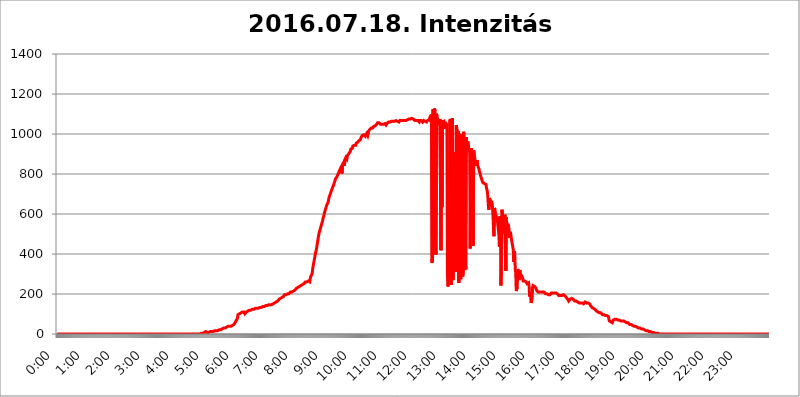
| Category | 2016.07.18. Intenzitás [W/m^2] |
|---|---|
| 0.0 | 0 |
| 0.0006944444444444445 | 0 |
| 0.001388888888888889 | 0 |
| 0.0020833333333333333 | 0 |
| 0.002777777777777778 | 0 |
| 0.003472222222222222 | 0 |
| 0.004166666666666667 | 0 |
| 0.004861111111111111 | 0 |
| 0.005555555555555556 | 0 |
| 0.0062499999999999995 | 0 |
| 0.006944444444444444 | 0 |
| 0.007638888888888889 | 0 |
| 0.008333333333333333 | 0 |
| 0.009027777777777779 | 0 |
| 0.009722222222222222 | 0 |
| 0.010416666666666666 | 0 |
| 0.011111111111111112 | 0 |
| 0.011805555555555555 | 0 |
| 0.012499999999999999 | 0 |
| 0.013194444444444444 | 0 |
| 0.013888888888888888 | 0 |
| 0.014583333333333332 | 0 |
| 0.015277777777777777 | 0 |
| 0.015972222222222224 | 0 |
| 0.016666666666666666 | 0 |
| 0.017361111111111112 | 0 |
| 0.018055555555555557 | 0 |
| 0.01875 | 0 |
| 0.019444444444444445 | 0 |
| 0.02013888888888889 | 0 |
| 0.020833333333333332 | 0 |
| 0.02152777777777778 | 0 |
| 0.022222222222222223 | 0 |
| 0.02291666666666667 | 0 |
| 0.02361111111111111 | 0 |
| 0.024305555555555556 | 0 |
| 0.024999999999999998 | 0 |
| 0.025694444444444447 | 0 |
| 0.02638888888888889 | 0 |
| 0.027083333333333334 | 0 |
| 0.027777777777777776 | 0 |
| 0.02847222222222222 | 0 |
| 0.029166666666666664 | 0 |
| 0.029861111111111113 | 0 |
| 0.030555555555555555 | 0 |
| 0.03125 | 0 |
| 0.03194444444444445 | 0 |
| 0.03263888888888889 | 0 |
| 0.03333333333333333 | 0 |
| 0.034027777777777775 | 0 |
| 0.034722222222222224 | 0 |
| 0.035416666666666666 | 0 |
| 0.036111111111111115 | 0 |
| 0.03680555555555556 | 0 |
| 0.0375 | 0 |
| 0.03819444444444444 | 0 |
| 0.03888888888888889 | 0 |
| 0.03958333333333333 | 0 |
| 0.04027777777777778 | 0 |
| 0.04097222222222222 | 0 |
| 0.041666666666666664 | 0 |
| 0.042361111111111106 | 0 |
| 0.04305555555555556 | 0 |
| 0.043750000000000004 | 0 |
| 0.044444444444444446 | 0 |
| 0.04513888888888889 | 0 |
| 0.04583333333333334 | 0 |
| 0.04652777777777778 | 0 |
| 0.04722222222222222 | 0 |
| 0.04791666666666666 | 0 |
| 0.04861111111111111 | 0 |
| 0.049305555555555554 | 0 |
| 0.049999999999999996 | 0 |
| 0.05069444444444445 | 0 |
| 0.051388888888888894 | 0 |
| 0.052083333333333336 | 0 |
| 0.05277777777777778 | 0 |
| 0.05347222222222222 | 0 |
| 0.05416666666666667 | 0 |
| 0.05486111111111111 | 0 |
| 0.05555555555555555 | 0 |
| 0.05625 | 0 |
| 0.05694444444444444 | 0 |
| 0.057638888888888885 | 0 |
| 0.05833333333333333 | 0 |
| 0.05902777777777778 | 0 |
| 0.059722222222222225 | 0 |
| 0.06041666666666667 | 0 |
| 0.061111111111111116 | 0 |
| 0.06180555555555556 | 0 |
| 0.0625 | 0 |
| 0.06319444444444444 | 0 |
| 0.06388888888888888 | 0 |
| 0.06458333333333334 | 0 |
| 0.06527777777777778 | 0 |
| 0.06597222222222222 | 0 |
| 0.06666666666666667 | 0 |
| 0.06736111111111111 | 0 |
| 0.06805555555555555 | 0 |
| 0.06874999999999999 | 0 |
| 0.06944444444444443 | 0 |
| 0.07013888888888889 | 0 |
| 0.07083333333333333 | 0 |
| 0.07152777777777779 | 0 |
| 0.07222222222222223 | 0 |
| 0.07291666666666667 | 0 |
| 0.07361111111111111 | 0 |
| 0.07430555555555556 | 0 |
| 0.075 | 0 |
| 0.07569444444444444 | 0 |
| 0.0763888888888889 | 0 |
| 0.07708333333333334 | 0 |
| 0.07777777777777778 | 0 |
| 0.07847222222222222 | 0 |
| 0.07916666666666666 | 0 |
| 0.0798611111111111 | 0 |
| 0.08055555555555556 | 0 |
| 0.08125 | 0 |
| 0.08194444444444444 | 0 |
| 0.08263888888888889 | 0 |
| 0.08333333333333333 | 0 |
| 0.08402777777777777 | 0 |
| 0.08472222222222221 | 0 |
| 0.08541666666666665 | 0 |
| 0.08611111111111112 | 0 |
| 0.08680555555555557 | 0 |
| 0.08750000000000001 | 0 |
| 0.08819444444444445 | 0 |
| 0.08888888888888889 | 0 |
| 0.08958333333333333 | 0 |
| 0.09027777777777778 | 0 |
| 0.09097222222222222 | 0 |
| 0.09166666666666667 | 0 |
| 0.09236111111111112 | 0 |
| 0.09305555555555556 | 0 |
| 0.09375 | 0 |
| 0.09444444444444444 | 0 |
| 0.09513888888888888 | 0 |
| 0.09583333333333333 | 0 |
| 0.09652777777777777 | 0 |
| 0.09722222222222222 | 0 |
| 0.09791666666666667 | 0 |
| 0.09861111111111111 | 0 |
| 0.09930555555555555 | 0 |
| 0.09999999999999999 | 0 |
| 0.10069444444444443 | 0 |
| 0.1013888888888889 | 0 |
| 0.10208333333333335 | 0 |
| 0.10277777777777779 | 0 |
| 0.10347222222222223 | 0 |
| 0.10416666666666667 | 0 |
| 0.10486111111111111 | 0 |
| 0.10555555555555556 | 0 |
| 0.10625 | 0 |
| 0.10694444444444444 | 0 |
| 0.1076388888888889 | 0 |
| 0.10833333333333334 | 0 |
| 0.10902777777777778 | 0 |
| 0.10972222222222222 | 0 |
| 0.1111111111111111 | 0 |
| 0.11180555555555556 | 0 |
| 0.11180555555555556 | 0 |
| 0.1125 | 0 |
| 0.11319444444444444 | 0 |
| 0.11388888888888889 | 0 |
| 0.11458333333333333 | 0 |
| 0.11527777777777777 | 0 |
| 0.11597222222222221 | 0 |
| 0.11666666666666665 | 0 |
| 0.1173611111111111 | 0 |
| 0.11805555555555557 | 0 |
| 0.11944444444444445 | 0 |
| 0.12013888888888889 | 0 |
| 0.12083333333333333 | 0 |
| 0.12152777777777778 | 0 |
| 0.12222222222222223 | 0 |
| 0.12291666666666667 | 0 |
| 0.12291666666666667 | 0 |
| 0.12361111111111112 | 0 |
| 0.12430555555555556 | 0 |
| 0.125 | 0 |
| 0.12569444444444444 | 0 |
| 0.12638888888888888 | 0 |
| 0.12708333333333333 | 0 |
| 0.16875 | 0 |
| 0.12847222222222224 | 0 |
| 0.12916666666666668 | 0 |
| 0.12986111111111112 | 0 |
| 0.13055555555555556 | 0 |
| 0.13125 | 0 |
| 0.13194444444444445 | 0 |
| 0.1326388888888889 | 0 |
| 0.13333333333333333 | 0 |
| 0.13402777777777777 | 0 |
| 0.13402777777777777 | 0 |
| 0.13472222222222222 | 0 |
| 0.13541666666666666 | 0 |
| 0.1361111111111111 | 0 |
| 0.13749999999999998 | 0 |
| 0.13819444444444443 | 0 |
| 0.1388888888888889 | 0 |
| 0.13958333333333334 | 0 |
| 0.14027777777777778 | 0 |
| 0.14097222222222222 | 0 |
| 0.14166666666666666 | 0 |
| 0.1423611111111111 | 0 |
| 0.14305555555555557 | 0 |
| 0.14375000000000002 | 0 |
| 0.14444444444444446 | 0 |
| 0.1451388888888889 | 0 |
| 0.1451388888888889 | 0 |
| 0.14652777777777778 | 0 |
| 0.14722222222222223 | 0 |
| 0.14791666666666667 | 0 |
| 0.1486111111111111 | 0 |
| 0.14930555555555555 | 0 |
| 0.15 | 0 |
| 0.15069444444444444 | 0 |
| 0.15138888888888888 | 0 |
| 0.15208333333333332 | 0 |
| 0.15277777777777776 | 0 |
| 0.15347222222222223 | 0 |
| 0.15416666666666667 | 0 |
| 0.15486111111111112 | 0 |
| 0.15555555555555556 | 0 |
| 0.15625 | 0 |
| 0.15694444444444444 | 0 |
| 0.15763888888888888 | 0 |
| 0.15833333333333333 | 0 |
| 0.15902777777777777 | 0 |
| 0.15972222222222224 | 0 |
| 0.16041666666666668 | 0 |
| 0.16111111111111112 | 0 |
| 0.16180555555555556 | 0 |
| 0.1625 | 0 |
| 0.16319444444444445 | 0 |
| 0.1638888888888889 | 0 |
| 0.16458333333333333 | 0 |
| 0.16527777777777777 | 0 |
| 0.16597222222222222 | 0 |
| 0.16666666666666666 | 0 |
| 0.1673611111111111 | 0 |
| 0.16805555555555554 | 0 |
| 0.16874999999999998 | 0 |
| 0.16944444444444443 | 0 |
| 0.17013888888888887 | 0 |
| 0.1708333333333333 | 0 |
| 0.17152777777777775 | 0 |
| 0.17222222222222225 | 0 |
| 0.1729166666666667 | 0 |
| 0.17361111111111113 | 0 |
| 0.17430555555555557 | 0 |
| 0.17500000000000002 | 0 |
| 0.17569444444444446 | 0 |
| 0.1763888888888889 | 0 |
| 0.17708333333333334 | 0 |
| 0.17777777777777778 | 0 |
| 0.17847222222222223 | 0 |
| 0.17916666666666667 | 0 |
| 0.1798611111111111 | 0 |
| 0.18055555555555555 | 0 |
| 0.18125 | 0 |
| 0.18194444444444444 | 0 |
| 0.1826388888888889 | 0 |
| 0.18333333333333335 | 0 |
| 0.1840277777777778 | 0 |
| 0.18472222222222223 | 0 |
| 0.18541666666666667 | 0 |
| 0.18611111111111112 | 0 |
| 0.18680555555555556 | 0 |
| 0.1875 | 0 |
| 0.18819444444444444 | 0 |
| 0.18888888888888888 | 0 |
| 0.18958333333333333 | 0 |
| 0.19027777777777777 | 0 |
| 0.1909722222222222 | 0 |
| 0.19166666666666665 | 0 |
| 0.19236111111111112 | 0 |
| 0.19305555555555554 | 0 |
| 0.19375 | 0 |
| 0.19444444444444445 | 0 |
| 0.1951388888888889 | 0 |
| 0.19583333333333333 | 0 |
| 0.19652777777777777 | 0 |
| 0.19722222222222222 | 0 |
| 0.19791666666666666 | 0 |
| 0.1986111111111111 | 0 |
| 0.19930555555555554 | 0 |
| 0.19999999999999998 | 0 |
| 0.20069444444444443 | 0 |
| 0.20138888888888887 | 3.525 |
| 0.2020833333333333 | 3.525 |
| 0.2027777777777778 | 3.525 |
| 0.2034722222222222 | 3.525 |
| 0.2041666666666667 | 3.525 |
| 0.20486111111111113 | 3.525 |
| 0.20555555555555557 | 3.525 |
| 0.20625000000000002 | 7.887 |
| 0.20694444444444446 | 7.887 |
| 0.2076388888888889 | 7.887 |
| 0.20833333333333334 | 12.257 |
| 0.20902777777777778 | 12.257 |
| 0.20972222222222223 | 12.257 |
| 0.21041666666666667 | 7.887 |
| 0.2111111111111111 | 7.887 |
| 0.21180555555555555 | 7.887 |
| 0.2125 | 7.887 |
| 0.21319444444444444 | 7.887 |
| 0.2138888888888889 | 12.257 |
| 0.21458333333333335 | 12.257 |
| 0.2152777777777778 | 12.257 |
| 0.21597222222222223 | 12.257 |
| 0.21666666666666667 | 12.257 |
| 0.21736111111111112 | 12.257 |
| 0.21805555555555556 | 12.257 |
| 0.21875 | 12.257 |
| 0.21944444444444444 | 12.257 |
| 0.22013888888888888 | 16.636 |
| 0.22083333333333333 | 16.636 |
| 0.22152777777777777 | 16.636 |
| 0.2222222222222222 | 16.636 |
| 0.22291666666666665 | 16.636 |
| 0.2236111111111111 | 16.636 |
| 0.22430555555555556 | 16.636 |
| 0.225 | 16.636 |
| 0.22569444444444445 | 16.636 |
| 0.2263888888888889 | 21.024 |
| 0.22708333333333333 | 21.024 |
| 0.22777777777777777 | 21.024 |
| 0.22847222222222222 | 21.024 |
| 0.22916666666666666 | 21.024 |
| 0.2298611111111111 | 21.024 |
| 0.23055555555555554 | 21.024 |
| 0.23124999999999998 | 25.419 |
| 0.23194444444444443 | 25.419 |
| 0.23263888888888887 | 25.419 |
| 0.2333333333333333 | 29.823 |
| 0.2340277777777778 | 29.823 |
| 0.2347222222222222 | 29.823 |
| 0.2354166666666667 | 29.823 |
| 0.23611111111111113 | 29.823 |
| 0.23680555555555557 | 34.234 |
| 0.23750000000000002 | 34.234 |
| 0.23819444444444446 | 34.234 |
| 0.2388888888888889 | 38.653 |
| 0.23958333333333334 | 38.653 |
| 0.24027777777777778 | 38.653 |
| 0.24097222222222223 | 38.653 |
| 0.24166666666666667 | 38.653 |
| 0.2423611111111111 | 38.653 |
| 0.24305555555555555 | 38.653 |
| 0.24375 | 38.653 |
| 0.24444444444444446 | 38.653 |
| 0.24513888888888888 | 43.079 |
| 0.24583333333333335 | 43.079 |
| 0.2465277777777778 | 47.511 |
| 0.24722222222222223 | 47.511 |
| 0.24791666666666667 | 47.511 |
| 0.24861111111111112 | 51.951 |
| 0.24930555555555556 | 47.511 |
| 0.25 | 60.85 |
| 0.25069444444444444 | 65.31 |
| 0.2513888888888889 | 69.775 |
| 0.2520833333333333 | 74.246 |
| 0.25277777777777777 | 78.722 |
| 0.2534722222222222 | 96.682 |
| 0.25416666666666665 | 101.184 |
| 0.2548611111111111 | 101.184 |
| 0.2555555555555556 | 101.184 |
| 0.25625000000000003 | 101.184 |
| 0.2569444444444445 | 105.69 |
| 0.2576388888888889 | 105.69 |
| 0.25833333333333336 | 105.69 |
| 0.2590277777777778 | 110.201 |
| 0.25972222222222224 | 110.201 |
| 0.2604166666666667 | 110.201 |
| 0.2611111111111111 | 110.201 |
| 0.26180555555555557 | 110.201 |
| 0.2625 | 110.201 |
| 0.26319444444444445 | 101.184 |
| 0.2638888888888889 | 105.69 |
| 0.26458333333333334 | 105.69 |
| 0.2652777777777778 | 110.201 |
| 0.2659722222222222 | 110.201 |
| 0.26666666666666666 | 114.716 |
| 0.2673611111111111 | 114.716 |
| 0.26805555555555555 | 119.235 |
| 0.26875 | 114.716 |
| 0.26944444444444443 | 119.235 |
| 0.2701388888888889 | 119.235 |
| 0.2708333333333333 | 119.235 |
| 0.27152777777777776 | 119.235 |
| 0.2722222222222222 | 119.235 |
| 0.27291666666666664 | 119.235 |
| 0.2736111111111111 | 123.758 |
| 0.2743055555555555 | 123.758 |
| 0.27499999999999997 | 123.758 |
| 0.27569444444444446 | 123.758 |
| 0.27638888888888885 | 123.758 |
| 0.27708333333333335 | 128.284 |
| 0.2777777777777778 | 128.284 |
| 0.27847222222222223 | 128.284 |
| 0.2791666666666667 | 128.284 |
| 0.2798611111111111 | 128.284 |
| 0.28055555555555556 | 128.284 |
| 0.28125 | 128.284 |
| 0.28194444444444444 | 128.284 |
| 0.2826388888888889 | 128.284 |
| 0.2833333333333333 | 132.814 |
| 0.28402777777777777 | 132.814 |
| 0.2847222222222222 | 132.814 |
| 0.28541666666666665 | 132.814 |
| 0.28611111111111115 | 132.814 |
| 0.28680555555555554 | 132.814 |
| 0.28750000000000003 | 137.347 |
| 0.2881944444444445 | 137.347 |
| 0.2888888888888889 | 137.347 |
| 0.28958333333333336 | 137.347 |
| 0.2902777777777778 | 137.347 |
| 0.29097222222222224 | 137.347 |
| 0.2916666666666667 | 137.347 |
| 0.2923611111111111 | 141.884 |
| 0.29305555555555557 | 141.884 |
| 0.29375 | 141.884 |
| 0.29444444444444445 | 141.884 |
| 0.2951388888888889 | 141.884 |
| 0.29583333333333334 | 146.423 |
| 0.2965277777777778 | 146.423 |
| 0.2972222222222222 | 146.423 |
| 0.29791666666666666 | 146.423 |
| 0.2986111111111111 | 146.423 |
| 0.29930555555555555 | 146.423 |
| 0.3 | 146.423 |
| 0.30069444444444443 | 146.423 |
| 0.3013888888888889 | 150.964 |
| 0.3020833333333333 | 150.964 |
| 0.30277777777777776 | 150.964 |
| 0.3034722222222222 | 150.964 |
| 0.30416666666666664 | 155.509 |
| 0.3048611111111111 | 155.509 |
| 0.3055555555555555 | 155.509 |
| 0.30624999999999997 | 160.056 |
| 0.3069444444444444 | 160.056 |
| 0.3076388888888889 | 164.605 |
| 0.30833333333333335 | 164.605 |
| 0.3090277777777778 | 164.605 |
| 0.30972222222222223 | 169.156 |
| 0.3104166666666667 | 169.156 |
| 0.3111111111111111 | 173.709 |
| 0.31180555555555556 | 173.709 |
| 0.3125 | 173.709 |
| 0.31319444444444444 | 178.264 |
| 0.3138888888888889 | 178.264 |
| 0.3145833333333333 | 182.82 |
| 0.31527777777777777 | 182.82 |
| 0.3159722222222222 | 182.82 |
| 0.31666666666666665 | 182.82 |
| 0.31736111111111115 | 187.378 |
| 0.31805555555555554 | 191.937 |
| 0.31875000000000003 | 196.497 |
| 0.3194444444444445 | 196.497 |
| 0.3201388888888889 | 196.497 |
| 0.32083333333333336 | 196.497 |
| 0.3215277777777778 | 196.497 |
| 0.32222222222222224 | 196.497 |
| 0.3229166666666667 | 201.058 |
| 0.3236111111111111 | 201.058 |
| 0.32430555555555557 | 201.058 |
| 0.325 | 201.058 |
| 0.32569444444444445 | 205.62 |
| 0.3263888888888889 | 205.62 |
| 0.32708333333333334 | 210.182 |
| 0.3277777777777778 | 210.182 |
| 0.3284722222222222 | 210.182 |
| 0.32916666666666666 | 210.182 |
| 0.3298611111111111 | 214.746 |
| 0.33055555555555555 | 214.746 |
| 0.33125 | 214.746 |
| 0.33194444444444443 | 214.746 |
| 0.3326388888888889 | 219.309 |
| 0.3333333333333333 | 219.309 |
| 0.3340277777777778 | 223.873 |
| 0.3347222222222222 | 223.873 |
| 0.3354166666666667 | 228.436 |
| 0.3361111111111111 | 228.436 |
| 0.3368055555555556 | 228.436 |
| 0.33749999999999997 | 233 |
| 0.33819444444444446 | 233 |
| 0.33888888888888885 | 233 |
| 0.33958333333333335 | 237.564 |
| 0.34027777777777773 | 237.564 |
| 0.34097222222222223 | 242.127 |
| 0.3416666666666666 | 242.127 |
| 0.3423611111111111 | 242.127 |
| 0.3430555555555555 | 246.689 |
| 0.34375 | 246.689 |
| 0.3444444444444445 | 251.251 |
| 0.3451388888888889 | 251.251 |
| 0.3458333333333334 | 251.251 |
| 0.34652777777777777 | 255.813 |
| 0.34722222222222227 | 255.813 |
| 0.34791666666666665 | 260.373 |
| 0.34861111111111115 | 260.373 |
| 0.34930555555555554 | 260.373 |
| 0.35000000000000003 | 260.373 |
| 0.3506944444444444 | 260.373 |
| 0.3513888888888889 | 264.932 |
| 0.3520833333333333 | 264.932 |
| 0.3527777777777778 | 260.373 |
| 0.3534722222222222 | 269.49 |
| 0.3541666666666667 | 260.373 |
| 0.3548611111111111 | 278.603 |
| 0.35555555555555557 | 287.709 |
| 0.35625 | 292.259 |
| 0.35694444444444445 | 296.808 |
| 0.3576388888888889 | 305.898 |
| 0.35833333333333334 | 328.584 |
| 0.3590277777777778 | 342.162 |
| 0.3597222222222222 | 355.712 |
| 0.36041666666666666 | 369.23 |
| 0.3611111111111111 | 382.715 |
| 0.36180555555555555 | 396.164 |
| 0.3625 | 409.574 |
| 0.36319444444444443 | 418.492 |
| 0.3638888888888889 | 431.833 |
| 0.3645833333333333 | 449.551 |
| 0.3652777777777778 | 462.786 |
| 0.3659722222222222 | 480.356 |
| 0.3666666666666667 | 484.735 |
| 0.3673611111111111 | 506.542 |
| 0.3680555555555556 | 515.223 |
| 0.36874999999999997 | 523.88 |
| 0.36944444444444446 | 532.513 |
| 0.37013888888888885 | 541.121 |
| 0.37083333333333335 | 549.704 |
| 0.37152777777777773 | 558.261 |
| 0.37222222222222223 | 566.793 |
| 0.3729166666666666 | 579.542 |
| 0.3736111111111111 | 588.009 |
| 0.3743055555555555 | 596.45 |
| 0.375 | 609.062 |
| 0.3756944444444445 | 617.436 |
| 0.3763888888888889 | 625.784 |
| 0.3770833333333334 | 634.105 |
| 0.37777777777777777 | 642.4 |
| 0.37847222222222227 | 646.537 |
| 0.37916666666666665 | 638.256 |
| 0.37986111111111115 | 658.909 |
| 0.38055555555555554 | 663.019 |
| 0.38125000000000003 | 683.473 |
| 0.3819444444444444 | 683.473 |
| 0.3826388888888889 | 687.544 |
| 0.3833333333333333 | 703.762 |
| 0.3840277777777778 | 711.832 |
| 0.3847222222222222 | 715.858 |
| 0.3854166666666667 | 707.8 |
| 0.3861111111111111 | 731.896 |
| 0.38680555555555557 | 735.89 |
| 0.3875 | 743.859 |
| 0.38819444444444445 | 747.834 |
| 0.3888888888888889 | 759.723 |
| 0.38958333333333334 | 767.62 |
| 0.3902777777777778 | 775.492 |
| 0.3909722222222222 | 779.42 |
| 0.39166666666666666 | 775.492 |
| 0.3923611111111111 | 787.258 |
| 0.39305555555555555 | 791.169 |
| 0.39375 | 798.974 |
| 0.39444444444444443 | 802.868 |
| 0.3951388888888889 | 810.641 |
| 0.3958333333333333 | 814.519 |
| 0.3965277777777778 | 822.26 |
| 0.3972222222222222 | 826.123 |
| 0.3979166666666667 | 833.834 |
| 0.3986111111111111 | 841.526 |
| 0.3993055555555556 | 802.868 |
| 0.39999999999999997 | 845.365 |
| 0.40069444444444446 | 853.029 |
| 0.40138888888888885 | 856.855 |
| 0.40208333333333335 | 860.676 |
| 0.40277777777777773 | 841.526 |
| 0.40347222222222223 | 872.114 |
| 0.4041666666666666 | 875.918 |
| 0.4048611111111111 | 883.516 |
| 0.4055555555555555 | 883.516 |
| 0.40625 | 875.918 |
| 0.4069444444444445 | 891.099 |
| 0.4076388888888889 | 891.099 |
| 0.4083333333333334 | 887.309 |
| 0.40902777777777777 | 902.447 |
| 0.40972222222222227 | 902.447 |
| 0.41041666666666665 | 898.668 |
| 0.41111111111111115 | 913.766 |
| 0.41180555555555554 | 925.06 |
| 0.41250000000000003 | 921.298 |
| 0.4131944444444444 | 921.298 |
| 0.4138888888888889 | 928.819 |
| 0.4145833333333333 | 940.082 |
| 0.4152777777777778 | 940.082 |
| 0.4159722222222222 | 940.082 |
| 0.4166666666666667 | 943.832 |
| 0.4173611111111111 | 947.58 |
| 0.41805555555555557 | 943.832 |
| 0.41875 | 943.832 |
| 0.41944444444444445 | 955.071 |
| 0.4201388888888889 | 951.327 |
| 0.42083333333333334 | 951.327 |
| 0.4215277777777778 | 958.814 |
| 0.4222222222222222 | 955.071 |
| 0.42291666666666666 | 966.295 |
| 0.4236111111111111 | 970.034 |
| 0.42430555555555555 | 966.295 |
| 0.425 | 970.034 |
| 0.42569444444444443 | 977.508 |
| 0.4263888888888889 | 984.98 |
| 0.4270833333333333 | 981.244 |
| 0.4277777777777778 | 992.448 |
| 0.4284722222222222 | 992.448 |
| 0.4291666666666667 | 988.714 |
| 0.4298611111111111 | 996.182 |
| 0.4305555555555556 | 996.182 |
| 0.43124999999999997 | 996.182 |
| 0.43194444444444446 | 988.714 |
| 0.43263888888888885 | 996.182 |
| 0.43333333333333335 | 999.916 |
| 0.43402777777777773 | 1003.65 |
| 0.43472222222222223 | 1003.65 |
| 0.4354166666666666 | 992.448 |
| 0.4361111111111111 | 1003.65 |
| 0.4368055555555555 | 1014.852 |
| 0.4375 | 1018.587 |
| 0.4381944444444445 | 1022.323 |
| 0.4388888888888889 | 1026.06 |
| 0.4395833333333334 | 1026.06 |
| 0.44027777777777777 | 1029.798 |
| 0.44097222222222227 | 1029.798 |
| 0.44166666666666665 | 1029.798 |
| 0.44236111111111115 | 1029.798 |
| 0.44305555555555554 | 1033.537 |
| 0.44375000000000003 | 1037.277 |
| 0.4444444444444444 | 1037.277 |
| 0.4451388888888889 | 1033.537 |
| 0.4458333333333333 | 1041.019 |
| 0.4465277777777778 | 1037.277 |
| 0.4472222222222222 | 1044.762 |
| 0.4479166666666667 | 1048.508 |
| 0.4486111111111111 | 1052.255 |
| 0.44930555555555557 | 1056.004 |
| 0.45 | 1059.756 |
| 0.45069444444444445 | 1059.756 |
| 0.4513888888888889 | 1056.004 |
| 0.45208333333333334 | 1056.004 |
| 0.4527777777777778 | 1052.255 |
| 0.4534722222222222 | 1048.508 |
| 0.45416666666666666 | 1048.508 |
| 0.4548611111111111 | 1044.762 |
| 0.45555555555555555 | 1048.508 |
| 0.45625 | 1048.508 |
| 0.45694444444444443 | 1048.508 |
| 0.4576388888888889 | 1048.508 |
| 0.4583333333333333 | 1048.508 |
| 0.4590277777777778 | 1048.508 |
| 0.4597222222222222 | 1052.255 |
| 0.4604166666666667 | 1048.508 |
| 0.4611111111111111 | 1044.762 |
| 0.4618055555555556 | 1048.508 |
| 0.46249999999999997 | 1052.255 |
| 0.46319444444444446 | 1056.004 |
| 0.46388888888888885 | 1056.004 |
| 0.46458333333333335 | 1059.756 |
| 0.46527777777777773 | 1059.756 |
| 0.46597222222222223 | 1063.51 |
| 0.4666666666666666 | 1059.756 |
| 0.4673611111111111 | 1059.756 |
| 0.4680555555555555 | 1059.756 |
| 0.46875 | 1063.51 |
| 0.4694444444444445 | 1063.51 |
| 0.4701388888888889 | 1063.51 |
| 0.4708333333333334 | 1063.51 |
| 0.47152777777777777 | 1063.51 |
| 0.47222222222222227 | 1063.51 |
| 0.47291666666666665 | 1063.51 |
| 0.47361111111111115 | 1067.267 |
| 0.47430555555555554 | 1063.51 |
| 0.47500000000000003 | 1067.267 |
| 0.4756944444444444 | 1063.51 |
| 0.4763888888888889 | 1067.267 |
| 0.4770833333333333 | 1063.51 |
| 0.4777777777777778 | 1063.51 |
| 0.4784722222222222 | 1063.51 |
| 0.4791666666666667 | 1059.756 |
| 0.4798611111111111 | 1063.51 |
| 0.48055555555555557 | 1067.267 |
| 0.48125 | 1067.267 |
| 0.48194444444444445 | 1067.267 |
| 0.4826388888888889 | 1067.267 |
| 0.48333333333333334 | 1063.51 |
| 0.4840277777777778 | 1067.267 |
| 0.4847222222222222 | 1067.267 |
| 0.48541666666666666 | 1067.267 |
| 0.4861111111111111 | 1067.267 |
| 0.48680555555555555 | 1067.267 |
| 0.4875 | 1067.267 |
| 0.48819444444444443 | 1067.267 |
| 0.4888888888888889 | 1067.267 |
| 0.4895833333333333 | 1071.027 |
| 0.4902777777777778 | 1071.027 |
| 0.4909722222222222 | 1071.027 |
| 0.4916666666666667 | 1071.027 |
| 0.4923611111111111 | 1071.027 |
| 0.4930555555555556 | 1074.789 |
| 0.49374999999999997 | 1078.555 |
| 0.49444444444444446 | 1078.555 |
| 0.49513888888888885 | 1074.789 |
| 0.49583333333333335 | 1074.789 |
| 0.49652777777777773 | 1078.555 |
| 0.49722222222222223 | 1078.555 |
| 0.4979166666666666 | 1078.555 |
| 0.4986111111111111 | 1078.555 |
| 0.4993055555555555 | 1074.789 |
| 0.5 | 1074.789 |
| 0.5006944444444444 | 1071.027 |
| 0.5013888888888889 | 1067.267 |
| 0.5020833333333333 | 1063.51 |
| 0.5027777777777778 | 1067.267 |
| 0.5034722222222222 | 1067.267 |
| 0.5041666666666667 | 1071.027 |
| 0.5048611111111111 | 1067.267 |
| 0.5055555555555555 | 1067.267 |
| 0.50625 | 1067.267 |
| 0.5069444444444444 | 1067.267 |
| 0.5076388888888889 | 1059.756 |
| 0.5083333333333333 | 1067.267 |
| 0.5090277777777777 | 1063.51 |
| 0.5097222222222222 | 1067.267 |
| 0.5104166666666666 | 1067.267 |
| 0.5111111111111112 | 1067.267 |
| 0.5118055555555555 | 1063.51 |
| 0.5125000000000001 | 1059.756 |
| 0.5131944444444444 | 1063.51 |
| 0.513888888888889 | 1067.267 |
| 0.5145833333333333 | 1063.51 |
| 0.5152777777777778 | 1063.51 |
| 0.5159722222222222 | 1063.51 |
| 0.5166666666666667 | 1063.51 |
| 0.517361111111111 | 1067.267 |
| 0.5180555555555556 | 1059.756 |
| 0.5187499999999999 | 1059.756 |
| 0.5194444444444445 | 1067.267 |
| 0.5201388888888888 | 1063.51 |
| 0.5208333333333334 | 1067.267 |
| 0.5215277777777778 | 1071.027 |
| 0.5222222222222223 | 1078.555 |
| 0.5229166666666667 | 1082.324 |
| 0.5236111111111111 | 1067.267 |
| 0.5243055555555556 | 1086.097 |
| 0.525 | 1097.437 |
| 0.5256944444444445 | 355.712 |
| 0.5263888888888889 | 382.715 |
| 0.5270833333333333 | 1124.056 |
| 0.5277777777777778 | 471.582 |
| 0.5284722222222222 | 894.885 |
| 0.5291666666666667 | 1127.879 |
| 0.5298611111111111 | 1112.618 |
| 0.5305555555555556 | 427.39 |
| 0.53125 | 396.164 |
| 0.5319444444444444 | 1101.226 |
| 0.5326388888888889 | 1086.097 |
| 0.5333333333333333 | 1078.555 |
| 0.5340277777777778 | 1067.267 |
| 0.5347222222222222 | 1059.756 |
| 0.5354166666666667 | 1056.004 |
| 0.5361111111111111 | 1059.756 |
| 0.5368055555555555 | 1074.789 |
| 0.5375 | 1071.027 |
| 0.5381944444444444 | 418.492 |
| 0.5388888888888889 | 1067.267 |
| 0.5395833333333333 | 634.105 |
| 0.5402777777777777 | 1059.756 |
| 0.5409722222222222 | 1056.004 |
| 0.5416666666666666 | 1056.004 |
| 0.5423611111111112 | 1063.51 |
| 0.5430555555555555 | 1063.51 |
| 0.5437500000000001 | 1026.06 |
| 0.5444444444444444 | 1059.756 |
| 0.545138888888889 | 1052.255 |
| 0.5458333333333333 | 1052.255 |
| 0.5465277777777778 | 1044.762 |
| 0.5472222222222222 | 296.808 |
| 0.5479166666666667 | 237.564 |
| 0.548611111111111 | 251.251 |
| 0.5493055555555556 | 449.551 |
| 0.5499999999999999 | 264.932 |
| 0.5506944444444445 | 1067.267 |
| 0.5513888888888888 | 1074.789 |
| 0.5520833333333334 | 287.709 |
| 0.5527777777777778 | 246.689 |
| 0.5534722222222223 | 1067.267 |
| 0.5541666666666667 | 1078.555 |
| 0.5548611111111111 | 269.49 |
| 0.5555555555555556 | 301.354 |
| 0.55625 | 906.223 |
| 0.5569444444444445 | 471.582 |
| 0.5576388888888889 | 909.996 |
| 0.5583333333333333 | 387.202 |
| 0.5590277777777778 | 310.44 |
| 0.5597222222222222 | 1044.762 |
| 0.5604166666666667 | 1026.06 |
| 0.5611111111111111 | 1014.852 |
| 0.5618055555555556 | 992.448 |
| 0.5625 | 1014.852 |
| 0.5631944444444444 | 255.813 |
| 0.5638888888888889 | 999.916 |
| 0.5645833333333333 | 988.714 |
| 0.5652777777777778 | 966.295 |
| 0.5659722222222222 | 274.047 |
| 0.5666666666666667 | 999.916 |
| 0.5673611111111111 | 992.448 |
| 0.5680555555555555 | 391.685 |
| 0.56875 | 287.709 |
| 0.5694444444444444 | 319.517 |
| 0.5701388888888889 | 1011.118 |
| 0.5708333333333333 | 360.221 |
| 0.5715277777777777 | 319.517 |
| 0.5722222222222222 | 396.164 |
| 0.5729166666666666 | 324.052 |
| 0.5736111111111112 | 984.98 |
| 0.5743055555555555 | 958.814 |
| 0.5750000000000001 | 943.832 |
| 0.5756944444444444 | 962.555 |
| 0.576388888888889 | 955.071 |
| 0.5770833333333333 | 928.819 |
| 0.5777777777777778 | 917.534 |
| 0.5784722222222222 | 906.223 |
| 0.5791666666666667 | 427.39 |
| 0.579861111111111 | 767.62 |
| 0.5805555555555556 | 928.819 |
| 0.5812499999999999 | 902.447 |
| 0.5819444444444445 | 887.309 |
| 0.5826388888888888 | 747.834 |
| 0.5833333333333334 | 440.702 |
| 0.5840277777777778 | 917.534 |
| 0.5847222222222223 | 898.668 |
| 0.5854166666666667 | 883.516 |
| 0.5861111111111111 | 864.493 |
| 0.5868055555555556 | 853.029 |
| 0.5875 | 849.199 |
| 0.5881944444444445 | 841.526 |
| 0.5888888888888889 | 868.305 |
| 0.5895833333333333 | 845.365 |
| 0.5902777777777778 | 837.682 |
| 0.5909722222222222 | 829.981 |
| 0.5916666666666667 | 822.26 |
| 0.5923611111111111 | 810.641 |
| 0.5930555555555556 | 802.868 |
| 0.59375 | 791.169 |
| 0.5944444444444444 | 783.342 |
| 0.5951388888888889 | 775.492 |
| 0.5958333333333333 | 767.62 |
| 0.5965277777777778 | 763.674 |
| 0.5972222222222222 | 755.766 |
| 0.5979166666666667 | 751.803 |
| 0.5986111111111111 | 751.803 |
| 0.5993055555555555 | 751.803 |
| 0.6 | 747.834 |
| 0.6006944444444444 | 755.766 |
| 0.6013888888888889 | 747.834 |
| 0.6020833333333333 | 727.896 |
| 0.6027777777777777 | 719.877 |
| 0.6034722222222222 | 707.8 |
| 0.6041666666666666 | 707.8 |
| 0.6048611111111112 | 629.948 |
| 0.6055555555555555 | 621.613 |
| 0.6062500000000001 | 679.395 |
| 0.6069444444444444 | 675.311 |
| 0.607638888888889 | 663.019 |
| 0.6083333333333333 | 667.123 |
| 0.6090277777777778 | 658.909 |
| 0.6097222222222222 | 658.909 |
| 0.6104166666666667 | 638.256 |
| 0.611111111111111 | 642.4 |
| 0.6118055555555556 | 638.256 |
| 0.6124999999999999 | 489.108 |
| 0.6131944444444445 | 629.948 |
| 0.6138888888888888 | 621.613 |
| 0.6145833333333334 | 604.864 |
| 0.6152777777777778 | 592.233 |
| 0.6159722222222223 | 583.779 |
| 0.6166666666666667 | 575.299 |
| 0.6173611111111111 | 566.793 |
| 0.6180555555555556 | 571.049 |
| 0.61875 | 566.793 |
| 0.6194444444444445 | 493.475 |
| 0.6201388888888889 | 436.27 |
| 0.6208333333333333 | 588.009 |
| 0.6215277777777778 | 566.793 |
| 0.6222222222222222 | 242.127 |
| 0.6229166666666667 | 333.113 |
| 0.6236111111111111 | 621.613 |
| 0.6243055555555556 | 604.864 |
| 0.625 | 579.542 |
| 0.6256944444444444 | 562.53 |
| 0.6263888888888889 | 575.299 |
| 0.6270833333333333 | 502.192 |
| 0.6277777777777778 | 596.45 |
| 0.6284722222222222 | 592.233 |
| 0.6291666666666667 | 314.98 |
| 0.6298611111111111 | 583.779 |
| 0.6305555555555555 | 545.416 |
| 0.63125 | 541.121 |
| 0.6319444444444444 | 549.704 |
| 0.6326388888888889 | 545.416 |
| 0.6333333333333333 | 532.513 |
| 0.6340277777777777 | 489.108 |
| 0.6347222222222222 | 480.356 |
| 0.6354166666666666 | 510.885 |
| 0.6361111111111112 | 497.836 |
| 0.6368055555555555 | 480.356 |
| 0.6375000000000001 | 462.786 |
| 0.6381944444444444 | 449.551 |
| 0.638888888888889 | 436.27 |
| 0.6395833333333333 | 422.943 |
| 0.6402777777777778 | 360.221 |
| 0.6409722222222222 | 414.035 |
| 0.6416666666666667 | 405.108 |
| 0.642361111111111 | 324.052 |
| 0.6430555555555556 | 305.898 |
| 0.6437499999999999 | 214.746 |
| 0.6444444444444445 | 219.309 |
| 0.6451388888888888 | 233 |
| 0.6458333333333334 | 324.052 |
| 0.6465277777777778 | 319.517 |
| 0.6472222222222223 | 310.44 |
| 0.6479166666666667 | 269.49 |
| 0.6486111111111111 | 319.517 |
| 0.6493055555555556 | 305.898 |
| 0.65 | 296.808 |
| 0.6506944444444445 | 296.808 |
| 0.6513888888888889 | 296.808 |
| 0.6520833333333333 | 287.709 |
| 0.6527777777777778 | 278.603 |
| 0.6534722222222222 | 264.932 |
| 0.6541666666666667 | 260.373 |
| 0.6548611111111111 | 264.932 |
| 0.6555555555555556 | 264.932 |
| 0.65625 | 260.373 |
| 0.6569444444444444 | 260.373 |
| 0.6576388888888889 | 260.373 |
| 0.6583333333333333 | 255.813 |
| 0.6590277777777778 | 251.251 |
| 0.6597222222222222 | 251.251 |
| 0.6604166666666667 | 251.251 |
| 0.6611111111111111 | 255.813 |
| 0.6618055555555555 | 237.564 |
| 0.6625 | 187.378 |
| 0.6631944444444444 | 210.182 |
| 0.6638888888888889 | 191.937 |
| 0.6645833333333333 | 155.509 |
| 0.6652777777777777 | 164.605 |
| 0.6659722222222222 | 173.709 |
| 0.6666666666666666 | 233 |
| 0.6673611111111111 | 242.127 |
| 0.6680555555555556 | 242.127 |
| 0.6687500000000001 | 237.564 |
| 0.6694444444444444 | 237.564 |
| 0.6701388888888888 | 237.564 |
| 0.6708333333333334 | 233 |
| 0.6715277777777778 | 228.436 |
| 0.6722222222222222 | 219.309 |
| 0.6729166666666666 | 214.746 |
| 0.6736111111111112 | 214.746 |
| 0.6743055555555556 | 210.182 |
| 0.6749999999999999 | 210.182 |
| 0.6756944444444444 | 210.182 |
| 0.6763888888888889 | 210.182 |
| 0.6770833333333334 | 210.182 |
| 0.6777777777777777 | 205.62 |
| 0.6784722222222223 | 210.182 |
| 0.6791666666666667 | 210.182 |
| 0.6798611111111111 | 210.182 |
| 0.6805555555555555 | 210.182 |
| 0.68125 | 210.182 |
| 0.6819444444444445 | 210.182 |
| 0.6826388888888889 | 210.182 |
| 0.6833333333333332 | 210.182 |
| 0.6840277777777778 | 205.62 |
| 0.6847222222222222 | 201.058 |
| 0.6854166666666667 | 201.058 |
| 0.686111111111111 | 201.058 |
| 0.6868055555555556 | 201.058 |
| 0.6875 | 201.058 |
| 0.6881944444444444 | 201.058 |
| 0.688888888888889 | 196.497 |
| 0.6895833333333333 | 196.497 |
| 0.6902777777777778 | 196.497 |
| 0.6909722222222222 | 196.497 |
| 0.6916666666666668 | 196.497 |
| 0.6923611111111111 | 201.058 |
| 0.6930555555555555 | 205.62 |
| 0.69375 | 205.62 |
| 0.6944444444444445 | 210.182 |
| 0.6951388888888889 | 205.62 |
| 0.6958333333333333 | 205.62 |
| 0.6965277777777777 | 205.62 |
| 0.6972222222222223 | 205.62 |
| 0.6979166666666666 | 205.62 |
| 0.6986111111111111 | 205.62 |
| 0.6993055555555556 | 205.62 |
| 0.7000000000000001 | 205.62 |
| 0.7006944444444444 | 205.62 |
| 0.7013888888888888 | 201.058 |
| 0.7020833333333334 | 196.497 |
| 0.7027777777777778 | 196.497 |
| 0.7034722222222222 | 191.937 |
| 0.7041666666666666 | 191.937 |
| 0.7048611111111112 | 191.937 |
| 0.7055555555555556 | 191.937 |
| 0.7062499999999999 | 191.937 |
| 0.7069444444444444 | 196.497 |
| 0.7076388888888889 | 191.937 |
| 0.7083333333333334 | 196.497 |
| 0.7090277777777777 | 196.497 |
| 0.7097222222222223 | 196.497 |
| 0.7104166666666667 | 191.937 |
| 0.7111111111111111 | 191.937 |
| 0.7118055555555555 | 191.937 |
| 0.7125 | 191.937 |
| 0.7131944444444445 | 187.378 |
| 0.7138888888888889 | 182.82 |
| 0.7145833333333332 | 178.264 |
| 0.7152777777777778 | 178.264 |
| 0.7159722222222222 | 173.709 |
| 0.7166666666666667 | 169.156 |
| 0.717361111111111 | 164.605 |
| 0.7180555555555556 | 164.605 |
| 0.71875 | 164.605 |
| 0.7194444444444444 | 173.709 |
| 0.720138888888889 | 178.264 |
| 0.7208333333333333 | 178.264 |
| 0.7215277777777778 | 178.264 |
| 0.7222222222222222 | 178.264 |
| 0.7229166666666668 | 173.709 |
| 0.7236111111111111 | 173.709 |
| 0.7243055555555555 | 173.709 |
| 0.725 | 169.156 |
| 0.7256944444444445 | 164.605 |
| 0.7263888888888889 | 164.605 |
| 0.7270833333333333 | 160.056 |
| 0.7277777777777777 | 164.605 |
| 0.7284722222222223 | 164.605 |
| 0.7291666666666666 | 160.056 |
| 0.7298611111111111 | 160.056 |
| 0.7305555555555556 | 160.056 |
| 0.7312500000000001 | 160.056 |
| 0.7319444444444444 | 155.509 |
| 0.7326388888888888 | 155.509 |
| 0.7333333333333334 | 155.509 |
| 0.7340277777777778 | 155.509 |
| 0.7347222222222222 | 155.509 |
| 0.7354166666666666 | 155.509 |
| 0.7361111111111112 | 155.509 |
| 0.7368055555555556 | 150.964 |
| 0.7374999999999999 | 150.964 |
| 0.7381944444444444 | 150.964 |
| 0.7388888888888889 | 155.509 |
| 0.7395833333333334 | 155.509 |
| 0.7402777777777777 | 160.056 |
| 0.7409722222222223 | 160.056 |
| 0.7416666666666667 | 155.509 |
| 0.7423611111111111 | 155.509 |
| 0.7430555555555555 | 155.509 |
| 0.74375 | 155.509 |
| 0.7444444444444445 | 155.509 |
| 0.7451388888888889 | 155.509 |
| 0.7458333333333332 | 150.964 |
| 0.7465277777777778 | 150.964 |
| 0.7472222222222222 | 146.423 |
| 0.7479166666666667 | 141.884 |
| 0.748611111111111 | 137.347 |
| 0.7493055555555556 | 137.347 |
| 0.75 | 132.814 |
| 0.7506944444444444 | 128.284 |
| 0.751388888888889 | 128.284 |
| 0.7520833333333333 | 128.284 |
| 0.7527777777777778 | 128.284 |
| 0.7534722222222222 | 123.758 |
| 0.7541666666666668 | 123.758 |
| 0.7548611111111111 | 119.235 |
| 0.7555555555555555 | 119.235 |
| 0.75625 | 114.716 |
| 0.7569444444444445 | 114.716 |
| 0.7576388888888889 | 114.716 |
| 0.7583333333333333 | 110.201 |
| 0.7590277777777777 | 110.201 |
| 0.7597222222222223 | 105.69 |
| 0.7604166666666666 | 105.69 |
| 0.7611111111111111 | 105.69 |
| 0.7618055555555556 | 105.69 |
| 0.7625000000000001 | 105.69 |
| 0.7631944444444444 | 101.184 |
| 0.7638888888888888 | 101.184 |
| 0.7645833333333334 | 96.682 |
| 0.7652777777777778 | 96.682 |
| 0.7659722222222222 | 96.682 |
| 0.7666666666666666 | 96.682 |
| 0.7673611111111112 | 96.682 |
| 0.7680555555555556 | 96.682 |
| 0.7687499999999999 | 92.184 |
| 0.7694444444444444 | 92.184 |
| 0.7701388888888889 | 92.184 |
| 0.7708333333333334 | 92.184 |
| 0.7715277777777777 | 87.692 |
| 0.7722222222222223 | 87.692 |
| 0.7729166666666667 | 87.692 |
| 0.7736111111111111 | 87.692 |
| 0.7743055555555555 | 65.31 |
| 0.775 | 65.31 |
| 0.7756944444444445 | 60.85 |
| 0.7763888888888889 | 60.85 |
| 0.7770833333333332 | 60.85 |
| 0.7777777777777778 | 56.398 |
| 0.7784722222222222 | 56.398 |
| 0.7791666666666667 | 56.398 |
| 0.779861111111111 | 69.775 |
| 0.7805555555555556 | 69.775 |
| 0.78125 | 74.246 |
| 0.7819444444444444 | 74.246 |
| 0.782638888888889 | 74.246 |
| 0.7833333333333333 | 74.246 |
| 0.7840277777777778 | 74.246 |
| 0.7847222222222222 | 69.775 |
| 0.7854166666666668 | 69.775 |
| 0.7861111111111111 | 69.775 |
| 0.7868055555555555 | 69.775 |
| 0.7875 | 69.775 |
| 0.7881944444444445 | 69.775 |
| 0.7888888888888889 | 69.775 |
| 0.7895833333333333 | 65.31 |
| 0.7902777777777777 | 65.31 |
| 0.7909722222222223 | 65.31 |
| 0.7916666666666666 | 65.31 |
| 0.7923611111111111 | 65.31 |
| 0.7930555555555556 | 65.31 |
| 0.7937500000000001 | 65.31 |
| 0.7944444444444444 | 65.31 |
| 0.7951388888888888 | 60.85 |
| 0.7958333333333334 | 60.85 |
| 0.7965277777777778 | 60.85 |
| 0.7972222222222222 | 60.85 |
| 0.7979166666666666 | 60.85 |
| 0.7986111111111112 | 56.398 |
| 0.7993055555555556 | 56.398 |
| 0.7999999999999999 | 56.398 |
| 0.8006944444444444 | 56.398 |
| 0.8013888888888889 | 51.951 |
| 0.8020833333333334 | 51.951 |
| 0.8027777777777777 | 47.511 |
| 0.8034722222222223 | 47.511 |
| 0.8041666666666667 | 47.511 |
| 0.8048611111111111 | 47.511 |
| 0.8055555555555555 | 43.079 |
| 0.80625 | 43.079 |
| 0.8069444444444445 | 43.079 |
| 0.8076388888888889 | 43.079 |
| 0.8083333333333332 | 38.653 |
| 0.8090277777777778 | 38.653 |
| 0.8097222222222222 | 38.653 |
| 0.8104166666666667 | 38.653 |
| 0.811111111111111 | 38.653 |
| 0.8118055555555556 | 38.653 |
| 0.8125 | 34.234 |
| 0.8131944444444444 | 34.234 |
| 0.813888888888889 | 34.234 |
| 0.8145833333333333 | 34.234 |
| 0.8152777777777778 | 29.823 |
| 0.8159722222222222 | 29.823 |
| 0.8166666666666668 | 29.823 |
| 0.8173611111111111 | 29.823 |
| 0.8180555555555555 | 29.823 |
| 0.81875 | 29.823 |
| 0.8194444444444445 | 25.419 |
| 0.8201388888888889 | 25.419 |
| 0.8208333333333333 | 25.419 |
| 0.8215277777777777 | 25.419 |
| 0.8222222222222223 | 21.024 |
| 0.8229166666666666 | 21.024 |
| 0.8236111111111111 | 21.024 |
| 0.8243055555555556 | 21.024 |
| 0.8250000000000001 | 21.024 |
| 0.8256944444444444 | 16.636 |
| 0.8263888888888888 | 16.636 |
| 0.8270833333333334 | 16.636 |
| 0.8277777777777778 | 16.636 |
| 0.8284722222222222 | 12.257 |
| 0.8291666666666666 | 12.257 |
| 0.8298611111111112 | 12.257 |
| 0.8305555555555556 | 12.257 |
| 0.8312499999999999 | 12.257 |
| 0.8319444444444444 | 12.257 |
| 0.8326388888888889 | 7.887 |
| 0.8333333333333334 | 7.887 |
| 0.8340277777777777 | 7.887 |
| 0.8347222222222223 | 7.887 |
| 0.8354166666666667 | 7.887 |
| 0.8361111111111111 | 7.887 |
| 0.8368055555555555 | 3.525 |
| 0.8375 | 3.525 |
| 0.8381944444444445 | 3.525 |
| 0.8388888888888889 | 3.525 |
| 0.8395833333333332 | 3.525 |
| 0.8402777777777778 | 3.525 |
| 0.8409722222222222 | 3.525 |
| 0.8416666666666667 | 3.525 |
| 0.842361111111111 | 3.525 |
| 0.8430555555555556 | 3.525 |
| 0.84375 | 0 |
| 0.8444444444444444 | 0 |
| 0.845138888888889 | 0 |
| 0.8458333333333333 | 0 |
| 0.8465277777777778 | 0 |
| 0.8472222222222222 | 0 |
| 0.8479166666666668 | 0 |
| 0.8486111111111111 | 0 |
| 0.8493055555555555 | 0 |
| 0.85 | 0 |
| 0.8506944444444445 | 0 |
| 0.8513888888888889 | 0 |
| 0.8520833333333333 | 0 |
| 0.8527777777777777 | 0 |
| 0.8534722222222223 | 0 |
| 0.8541666666666666 | 0 |
| 0.8548611111111111 | 0 |
| 0.8555555555555556 | 0 |
| 0.8562500000000001 | 0 |
| 0.8569444444444444 | 0 |
| 0.8576388888888888 | 0 |
| 0.8583333333333334 | 0 |
| 0.8590277777777778 | 0 |
| 0.8597222222222222 | 0 |
| 0.8604166666666666 | 0 |
| 0.8611111111111112 | 0 |
| 0.8618055555555556 | 0 |
| 0.8624999999999999 | 0 |
| 0.8631944444444444 | 0 |
| 0.8638888888888889 | 0 |
| 0.8645833333333334 | 0 |
| 0.8652777777777777 | 0 |
| 0.8659722222222223 | 0 |
| 0.8666666666666667 | 0 |
| 0.8673611111111111 | 0 |
| 0.8680555555555555 | 0 |
| 0.86875 | 0 |
| 0.8694444444444445 | 0 |
| 0.8701388888888889 | 0 |
| 0.8708333333333332 | 0 |
| 0.8715277777777778 | 0 |
| 0.8722222222222222 | 0 |
| 0.8729166666666667 | 0 |
| 0.873611111111111 | 0 |
| 0.8743055555555556 | 0 |
| 0.875 | 0 |
| 0.8756944444444444 | 0 |
| 0.876388888888889 | 0 |
| 0.8770833333333333 | 0 |
| 0.8777777777777778 | 0 |
| 0.8784722222222222 | 0 |
| 0.8791666666666668 | 0 |
| 0.8798611111111111 | 0 |
| 0.8805555555555555 | 0 |
| 0.88125 | 0 |
| 0.8819444444444445 | 0 |
| 0.8826388888888889 | 0 |
| 0.8833333333333333 | 0 |
| 0.8840277777777777 | 0 |
| 0.8847222222222223 | 0 |
| 0.8854166666666666 | 0 |
| 0.8861111111111111 | 0 |
| 0.8868055555555556 | 0 |
| 0.8875000000000001 | 0 |
| 0.8881944444444444 | 0 |
| 0.8888888888888888 | 0 |
| 0.8895833333333334 | 0 |
| 0.8902777777777778 | 0 |
| 0.8909722222222222 | 0 |
| 0.8916666666666666 | 0 |
| 0.8923611111111112 | 0 |
| 0.8930555555555556 | 0 |
| 0.8937499999999999 | 0 |
| 0.8944444444444444 | 0 |
| 0.8951388888888889 | 0 |
| 0.8958333333333334 | 0 |
| 0.8965277777777777 | 0 |
| 0.8972222222222223 | 0 |
| 0.8979166666666667 | 0 |
| 0.8986111111111111 | 0 |
| 0.8993055555555555 | 0 |
| 0.9 | 0 |
| 0.9006944444444445 | 0 |
| 0.9013888888888889 | 0 |
| 0.9020833333333332 | 0 |
| 0.9027777777777778 | 0 |
| 0.9034722222222222 | 0 |
| 0.9041666666666667 | 0 |
| 0.904861111111111 | 0 |
| 0.9055555555555556 | 0 |
| 0.90625 | 0 |
| 0.9069444444444444 | 0 |
| 0.907638888888889 | 0 |
| 0.9083333333333333 | 0 |
| 0.9090277777777778 | 0 |
| 0.9097222222222222 | 0 |
| 0.9104166666666668 | 0 |
| 0.9111111111111111 | 0 |
| 0.9118055555555555 | 0 |
| 0.9125 | 0 |
| 0.9131944444444445 | 0 |
| 0.9138888888888889 | 0 |
| 0.9145833333333333 | 0 |
| 0.9152777777777777 | 0 |
| 0.9159722222222223 | 0 |
| 0.9166666666666666 | 0 |
| 0.9173611111111111 | 0 |
| 0.9180555555555556 | 0 |
| 0.9187500000000001 | 0 |
| 0.9194444444444444 | 0 |
| 0.9201388888888888 | 0 |
| 0.9208333333333334 | 0 |
| 0.9215277777777778 | 0 |
| 0.9222222222222222 | 0 |
| 0.9229166666666666 | 0 |
| 0.9236111111111112 | 0 |
| 0.9243055555555556 | 0 |
| 0.9249999999999999 | 0 |
| 0.9256944444444444 | 0 |
| 0.9263888888888889 | 0 |
| 0.9270833333333334 | 0 |
| 0.9277777777777777 | 0 |
| 0.9284722222222223 | 0 |
| 0.9291666666666667 | 0 |
| 0.9298611111111111 | 0 |
| 0.9305555555555555 | 0 |
| 0.93125 | 0 |
| 0.9319444444444445 | 0 |
| 0.9326388888888889 | 0 |
| 0.9333333333333332 | 0 |
| 0.9340277777777778 | 0 |
| 0.9347222222222222 | 0 |
| 0.9354166666666667 | 0 |
| 0.936111111111111 | 0 |
| 0.9368055555555556 | 0 |
| 0.9375 | 0 |
| 0.9381944444444444 | 0 |
| 0.938888888888889 | 0 |
| 0.9395833333333333 | 0 |
| 0.9402777777777778 | 0 |
| 0.9409722222222222 | 0 |
| 0.9416666666666668 | 0 |
| 0.9423611111111111 | 0 |
| 0.9430555555555555 | 0 |
| 0.94375 | 0 |
| 0.9444444444444445 | 0 |
| 0.9451388888888889 | 0 |
| 0.9458333333333333 | 0 |
| 0.9465277777777777 | 0 |
| 0.9472222222222223 | 0 |
| 0.9479166666666666 | 0 |
| 0.9486111111111111 | 0 |
| 0.9493055555555556 | 0 |
| 0.9500000000000001 | 0 |
| 0.9506944444444444 | 0 |
| 0.9513888888888888 | 0 |
| 0.9520833333333334 | 0 |
| 0.9527777777777778 | 0 |
| 0.9534722222222222 | 0 |
| 0.9541666666666666 | 0 |
| 0.9548611111111112 | 0 |
| 0.9555555555555556 | 0 |
| 0.9562499999999999 | 0 |
| 0.9569444444444444 | 0 |
| 0.9576388888888889 | 0 |
| 0.9583333333333334 | 0 |
| 0.9590277777777777 | 0 |
| 0.9597222222222223 | 0 |
| 0.9604166666666667 | 0 |
| 0.9611111111111111 | 0 |
| 0.9618055555555555 | 0 |
| 0.9625 | 0 |
| 0.9631944444444445 | 0 |
| 0.9638888888888889 | 0 |
| 0.9645833333333332 | 0 |
| 0.9652777777777778 | 0 |
| 0.9659722222222222 | 0 |
| 0.9666666666666667 | 0 |
| 0.967361111111111 | 0 |
| 0.9680555555555556 | 0 |
| 0.96875 | 0 |
| 0.9694444444444444 | 0 |
| 0.970138888888889 | 0 |
| 0.9708333333333333 | 0 |
| 0.9715277777777778 | 0 |
| 0.9722222222222222 | 0 |
| 0.9729166666666668 | 0 |
| 0.9736111111111111 | 0 |
| 0.9743055555555555 | 0 |
| 0.975 | 0 |
| 0.9756944444444445 | 0 |
| 0.9763888888888889 | 0 |
| 0.9770833333333333 | 0 |
| 0.9777777777777777 | 0 |
| 0.9784722222222223 | 0 |
| 0.9791666666666666 | 0 |
| 0.9798611111111111 | 0 |
| 0.9805555555555556 | 0 |
| 0.9812500000000001 | 0 |
| 0.9819444444444444 | 0 |
| 0.9826388888888888 | 0 |
| 0.9833333333333334 | 0 |
| 0.9840277777777778 | 0 |
| 0.9847222222222222 | 0 |
| 0.9854166666666666 | 0 |
| 0.9861111111111112 | 0 |
| 0.9868055555555556 | 0 |
| 0.9874999999999999 | 0 |
| 0.9881944444444444 | 0 |
| 0.9888888888888889 | 0 |
| 0.9895833333333334 | 0 |
| 0.9902777777777777 | 0 |
| 0.9909722222222223 | 0 |
| 0.9916666666666667 | 0 |
| 0.9923611111111111 | 0 |
| 0.9930555555555555 | 0 |
| 0.99375 | 0 |
| 0.9944444444444445 | 0 |
| 0.9951388888888889 | 0 |
| 0.9958333333333332 | 0 |
| 0.9965277777777778 | 0 |
| 0.9972222222222222 | 0 |
| 0.9979166666666667 | 0 |
| 0.998611111111111 | 0 |
| 0.9993055555555556 | 0 |